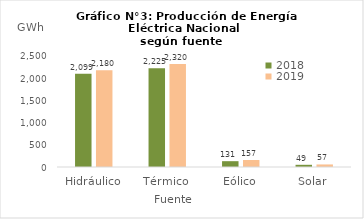
| Category | 2018 | 2019 |
|---|---|---|
| Hidráulico | 2098.785 | 2180.434 |
| Térmico | 2224.974 | 2319.86 |
| Eólico | 130.99 | 157.234 |
| Solar | 49.378 | 57.34 |